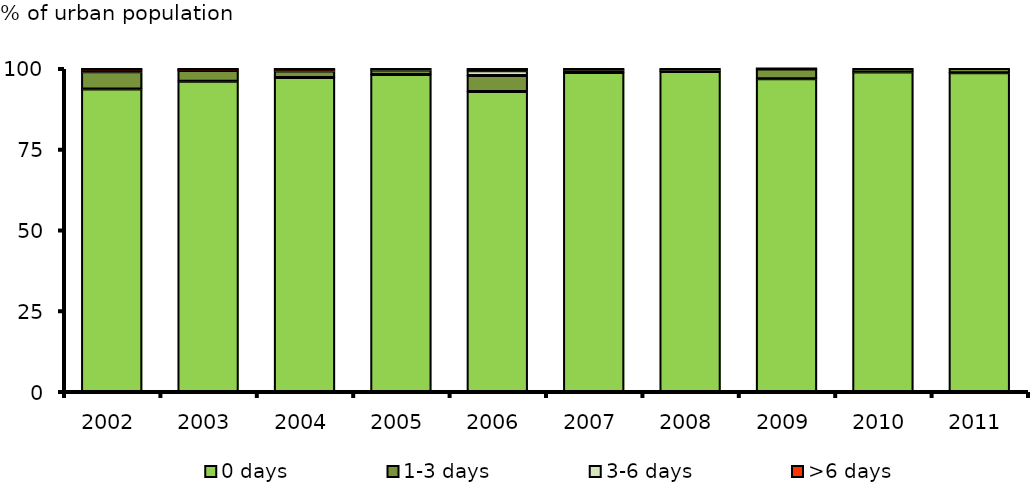
| Category | 0 days | 1-3 days | 3-6 days | >6 days |
|---|---|---|---|---|
| 2002.0 | 93.651 | 5.338 | 0.648 | 0.363 |
| 2003.0 | 96.031 | 3.346 | 0.244 | 0.38 |
| 2004.0 | 97.23 | 1.992 | 0.404 | 0.374 |
| 2005.0 | 98.159 | 1.347 | 0.495 | 0 |
| 2006.0 | 92.903 | 4.935 | 1.486 | 0.676 |
| 2007.0 | 98.74 | 0.868 | 0.392 | 0 |
| 2008.0 | 99.097 | 0.553 | 0.35 | 0 |
| 2009.0 | 96.792 | 3.061 | 0 | 0.147 |
| 2010.0 | 98.903 | 1.097 | 0 | 0 |
| 2011.0 | 98.721 | 1.279 | 0 | 0 |